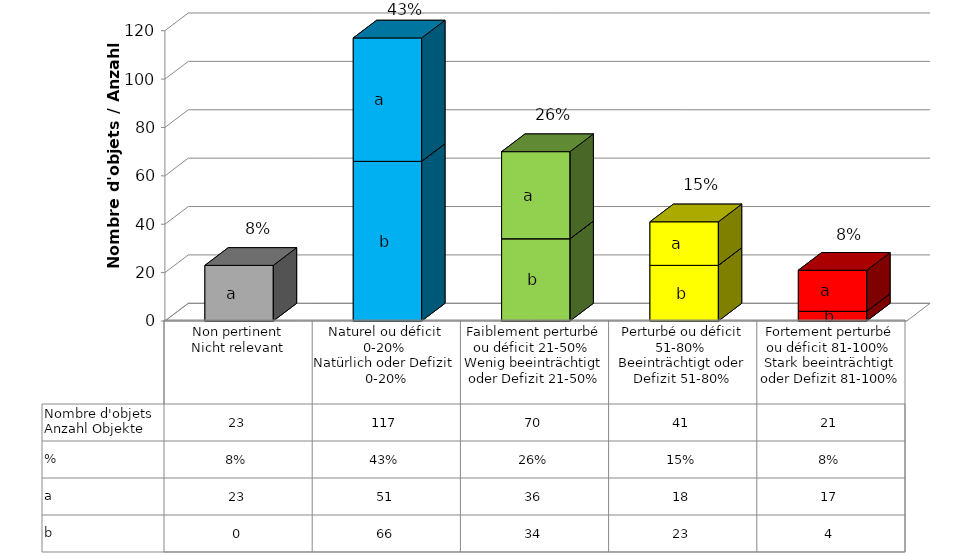
| Category | b | a   | % | Nombre d'objets
Anzahl Objekte |
|---|---|---|---|---|
| Non pertinent
Nicht relevant | 0 | 23 | 0.085 | 23 |
| Naturel ou déficit 0-20% 
Natürlich oder Defizit 
0-20% | 66 | 51 | 0.43 | 117 |
| Faiblement perturbé ou déficit 21-50% 
Wenig beeinträchtigt oder Defizit 21-50% | 34 | 36 | 0.257 | 70 |
| Perturbé ou déficit 51-80% 
Beeinträchtigt oder Defizit 51-80% | 23 | 18 | 0.151 | 41 |
| Fortement perturbé ou déficit 81-100% 
Stark beeinträchtigt oder Defizit 81-100% | 4 | 17 | 0.077 | 21 |